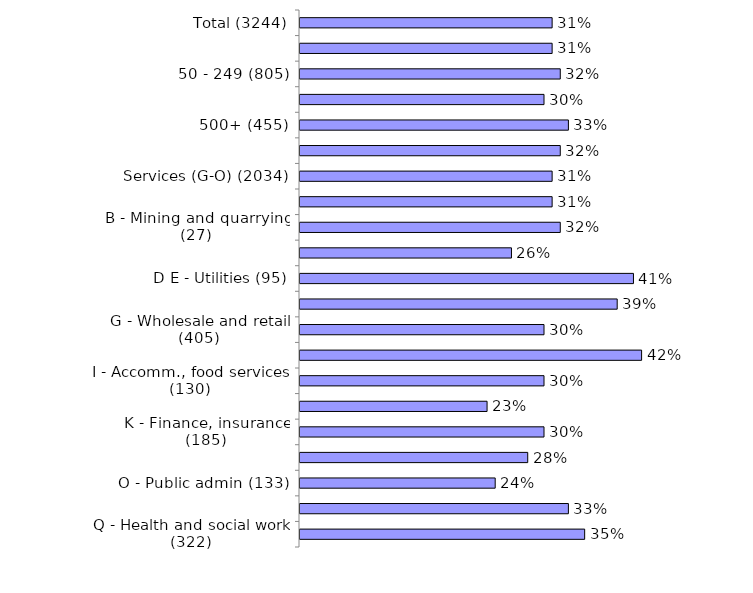
| Category | Series 0 |
|---|---|
| Total (3244) | 0.31 |
| 10-49 (1658) | 0.31 |
| 50 - 249 (805) | 0.32 |
| 250 - 499 (326) | 0.3 |
| 500+ (455) | 0.33 |
| Production (A-F) (1210) | 0.32 |
| Services (G-O) (2034) | 0.31 |
| A - Agriculture (96) | 0.31 |
| B - Mining and quarrying (27) | 0.32 |
| C - Manufacturing (866) | 0.26 |
| D E - Utilities (95) | 0.41 |
| F - Construction (126) | 0.39 |
| G - Wholesale and retail (405) | 0.3 |
| H - Transport , storage (148) | 0.42 |
| I - Accomm., food services (130) | 0.3 |
| J - Information, comms (110) | 0.23 |
| K - Finance, insurance (185) | 0.3 |
| LMNRS - Bus/tech/admin/arts/other (272) | 0.28 |
| O - Public admin (133) | 0.24 |
| P - Education (329) | 0.33 |
| Q - Health and social work (322) | 0.35 |